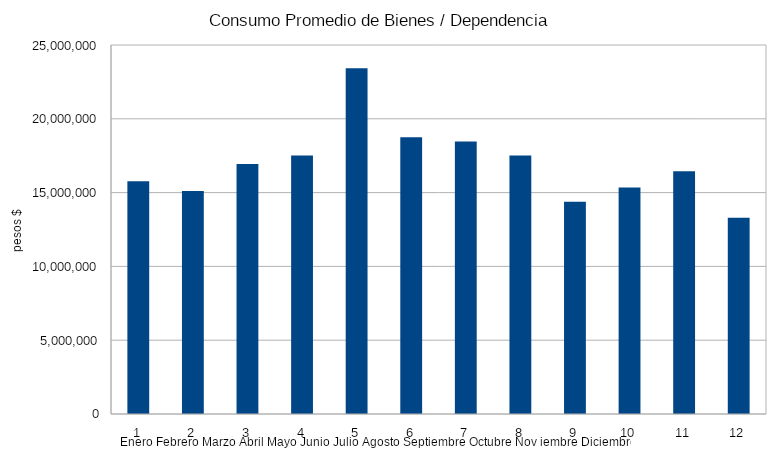
| Category | Series 0 |
|---|---|
| 0 | 15767522.121 |
| 1 | 15114561.424 |
| 2 | 16939824.758 |
| 3 | 17519271.242 |
| 4 | 23433239.061 |
| 5 | 18745712.394 |
| 6 | 18453982.264 |
| 7 | 17507343.725 |
| 8 | 14378460.832 |
| 9 | 15353418.528 |
| 10 | 16440960.379 |
| 11 | 13291430.554 |